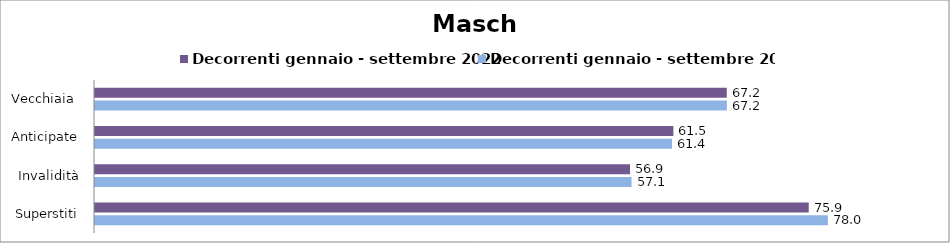
| Category | Decorrenti gennaio - settembre 2022 | Decorrenti gennaio - settembre 2023 |
|---|---|---|
| Vecchiaia  | 67.21 | 67.22 |
| Anticipate | 61.53 | 61.38 |
| Invalidità | 56.92 | 57.08 |
| Superstiti | 75.93 | 77.96 |